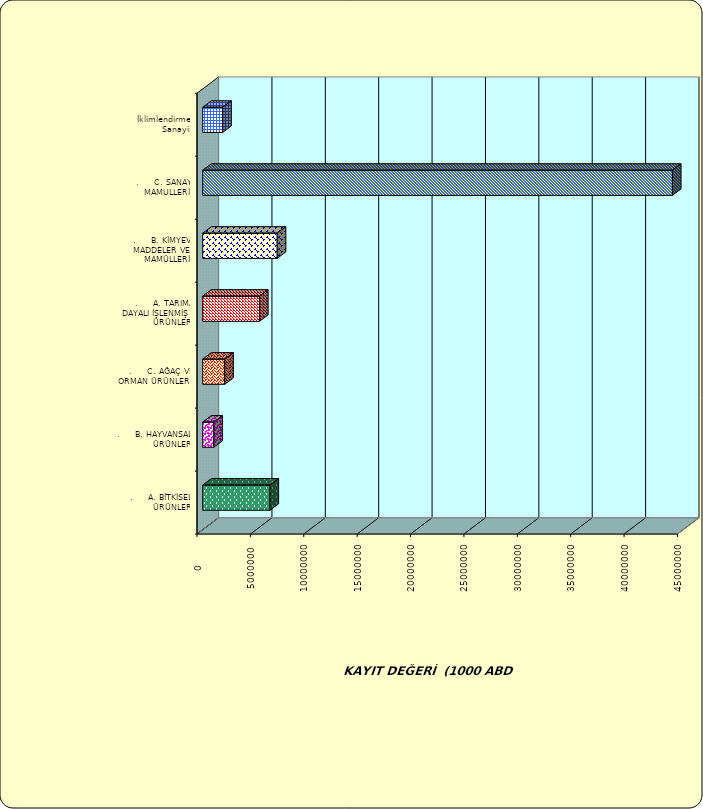
| Category | Series 0 |
|---|---|
| .     A. BİTKİSEL ÜRÜNLER | 6305926.001 |
| .     B. HAYVANSAL ÜRÜNLER | 1041494.906 |
| .     C. AĞAÇ VE ORMAN ÜRÜNLERİ | 2067968.403 |
| .     A. TARIMA DAYALI İŞLENMİŞ ÜRÜNLER | 5321553.476 |
| .     B. KİMYEVİ MADDELER VE MAMÜLLERİ | 6979733.17 |
| .     C. SANAYİ MAMULLERİ | 43995346.058 |
|  İklimlendirme Sanayii | 1875260.144 |